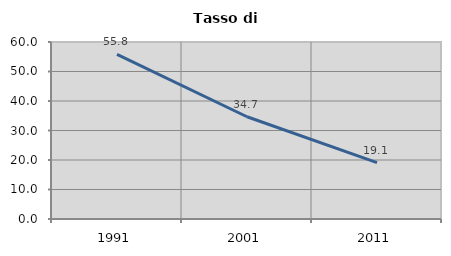
| Category | Tasso di disoccupazione   |
|---|---|
| 1991.0 | 55.819 |
| 2001.0 | 34.663 |
| 2011.0 | 19.094 |